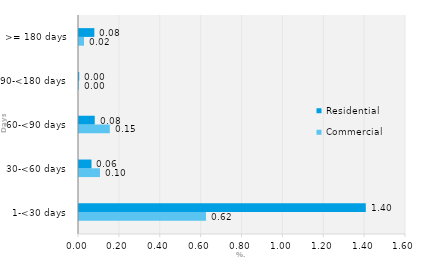
| Category | Commercial | Residential |
|---|---|---|
| 1-<30 days | 0.621 | 1.403 |
| 30-<60 days | 0.103 | 0.061 |
| 60-<90 days | 0.151 | 0.077 |
| 90-<180 days | 0 | 0.001 |
| >= 180 days | 0.025 | 0.075 |